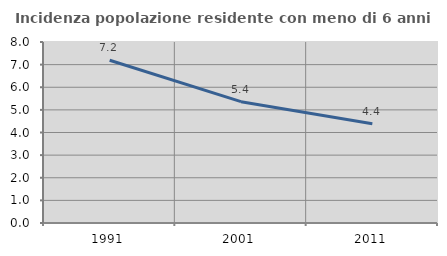
| Category | Incidenza popolazione residente con meno di 6 anni |
|---|---|
| 1991.0 | 7.194 |
| 2001.0 | 5.362 |
| 2011.0 | 4.384 |